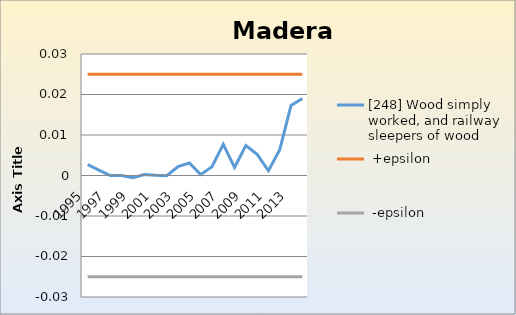
| Category | [248] Wood simply worked, and railway sleepers of wood |  +epsilon |  -epsilon |
|---|---|---|---|
| 1995.0 | 0.003 | 0.025 | -0.025 |
| 1996.0 | 0.001 | 0.025 | -0.025 |
| 1997.0 | 0 | 0.025 | -0.025 |
| 1998.0 | 0 | 0.025 | -0.025 |
| 1999.0 | -0.001 | 0.025 | -0.025 |
| 2000.0 | 0 | 0.025 | -0.025 |
| 2001.0 | 0 | 0.025 | -0.025 |
| 2002.0 | 0 | 0.025 | -0.025 |
| 2003.0 | 0.002 | 0.025 | -0.025 |
| 2004.0 | 0.003 | 0.025 | -0.025 |
| 2005.0 | 0 | 0.025 | -0.025 |
| 2006.0 | 0.002 | 0.025 | -0.025 |
| 2007.0 | 0.008 | 0.025 | -0.025 |
| 2008.0 | 0.002 | 0.025 | -0.025 |
| 2009.0 | 0.007 | 0.025 | -0.025 |
| 2010.0 | 0.005 | 0.025 | -0.025 |
| 2011.0 | 0.001 | 0.025 | -0.025 |
| 2012.0 | 0.006 | 0.025 | -0.025 |
| 2013.0 | 0.017 | 0.025 | -0.025 |
| 2014.0 | 0.019 | 0.025 | -0.025 |